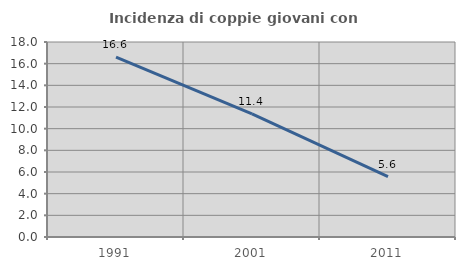
| Category | Incidenza di coppie giovani con figli |
|---|---|
| 1991.0 | 16.599 |
| 2001.0 | 11.355 |
| 2011.0 | 5.573 |